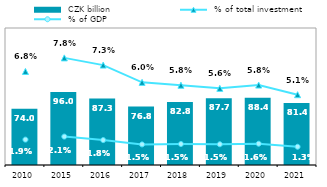
| Category |  CZK billion |
|---|---|
| 2010.0 | 74.018 |
| 2015.0 | 95.977 |
| 2016.0 | 87.256 |
| 2017.0 | 76.809 |
| 2018.0 | 82.84 |
| 2019.0 | 87.703 |
| 2020.0 | 88.434 |
| 2021.0 | 81.399 |